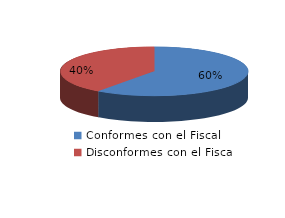
| Category | Series 0 |
|---|---|
| 0 | 802 |
| 1 | 534 |